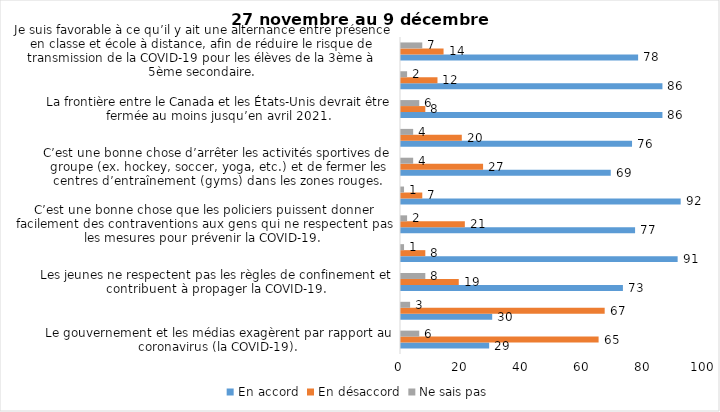
| Category | En accord | En désaccord | Ne sais pas |
|---|---|---|---|
| Le gouvernement et les médias exagèrent par rapport au coronavirus (la COVID-19). | 29 | 65 | 6 |
| Il est exagéré de rester chez soi pour se protéger contre le coronavirus (la COVID-19). | 30 | 67 | 3 |
| Les jeunes ne respectent pas les règles de confinement et contribuent à propager la COVID-19. | 73 | 19 | 8 |
| Je suis favorable à l’obligation de porter le masque ou le couvre-visage dans tous les lieux publics fermés (épiceries, magasins, restaurants, cinéma, lieux de culte, etc.). | 91 | 8 | 1 |
| C’est une bonne chose que les policiers puissent donner facilement des contraventions aux gens qui ne respectent pas les mesures pour prévenir la COVID-19. | 77 | 21 | 2 |
| Je suis favorable à l’obligation de porter le masque ou le couvre-visage lors des manifestations citoyennes. | 92 | 7 | 1 |
| C’est une bonne chose d’arrêter les activités sportives de groupe (ex. hockey, soccer, yoga, etc.) et de fermer les centres d’entraînement (gyms) dans les zones rouges. | 69 | 27 | 4 |
| Je suis favorable à l’obligation de porter le masque ou le couvre-visage en tout temps pour les élèves au secondaire. | 76 | 20 | 4 |
| La frontière entre le Canada et les États-Unis devrait être fermée au moins jusqu’en avril 2021. | 86 | 8 | 6 |
| J’ai peur que le système de santé soit débordé par les cas de COVID-19 suite à la période des fêtes. | 86 | 12 | 2 |
| Je suis favorable à ce qu’il y ait une alternance entre présence en classe et école à distance, afin de réduire le risque de transmission de la COVID-19 pour les élèves de la 3ème à 5ème secondaire. | 78 | 14 | 7 |